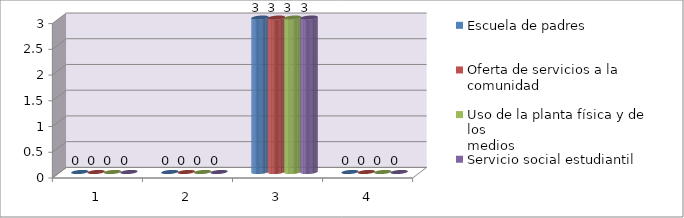
| Category | Escuela de padres | Oferta de servicios a la
comunidad | Uso de la planta física y de los
medios | Servicio social estudiantil |
|---|---|---|---|---|
| 0 | 0 | 0 | 0 | 0 |
| 1 | 0 | 0 | 0 | 0 |
| 2 | 3 | 3 | 3 | 3 |
| 3 | 0 | 0 | 0 | 0 |